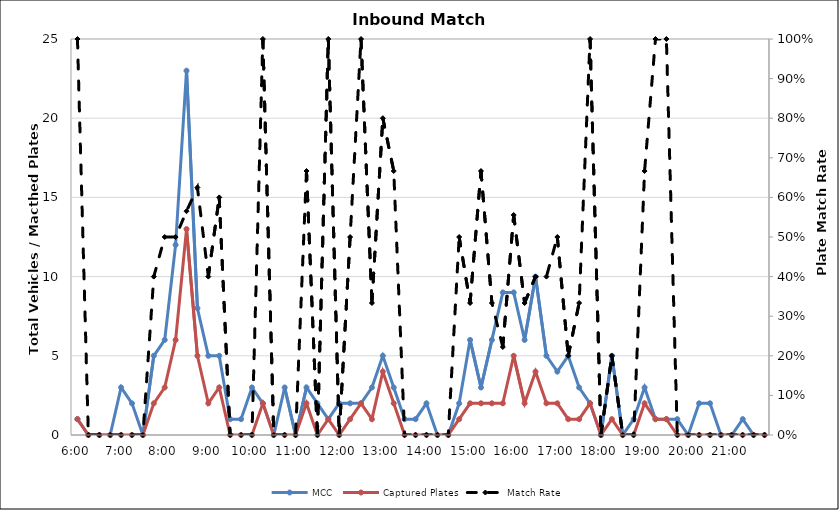
| Category | MCC | Captured Plates |
|---|---|---|
| 0.25 | 1 | 1 |
| 0.260416666666667 | 0 | 0 |
| 0.270833333333333 | 0 | 0 |
| 0.28125 | 0 | 0 |
| 0.291666666666667 | 3 | 0 |
| 0.302083333333333 | 2 | 0 |
| 0.3125 | 0 | 0 |
| 0.322916666666667 | 5 | 2 |
| 0.333333333333333 | 6 | 3 |
| 0.34375 | 12 | 6 |
| 0.354166666666667 | 23 | 13 |
| 0.364583333333333 | 8 | 5 |
| 0.375 | 5 | 2 |
| 0.385416666666667 | 5 | 3 |
| 0.395833333333333 | 1 | 0 |
| 0.40625 | 1 | 0 |
| 0.416666666666667 | 3 | 0 |
| 0.427083333333333 | 2 | 2 |
| 0.4375 | 0 | 0 |
| 0.447916666666667 | 3 | 0 |
| 0.458333333333333 | 0 | 0 |
| 0.46875 | 3 | 2 |
| 0.479166666666667 | 2 | 0 |
| 0.489583333333333 | 1 | 1 |
| 0.5 | 2 | 0 |
| 0.510416666666667 | 2 | 1 |
| 0.520833333333333 | 2 | 2 |
| 0.53125 | 3 | 1 |
| 0.541666666666667 | 5 | 4 |
| 0.552083333333333 | 3 | 2 |
| 0.5625 | 1 | 0 |
| 0.572916666666667 | 1 | 0 |
| 0.583333333333333 | 2 | 0 |
| 0.59375 | 0 | 0 |
| 0.604166666666667 | 0 | 0 |
| 0.614583333333333 | 2 | 1 |
| 0.625 | 6 | 2 |
| 0.635416666666667 | 3 | 2 |
| 0.645833333333333 | 6 | 2 |
| 0.65625 | 9 | 2 |
| 0.666666666666667 | 9 | 5 |
| 0.677083333333333 | 6 | 2 |
| 0.6875 | 10 | 4 |
| 0.697916666666667 | 5 | 2 |
| 0.708333333333333 | 4 | 2 |
| 0.71875 | 5 | 1 |
| 0.729166666666667 | 3 | 1 |
| 0.739583333333333 | 2 | 2 |
| 0.75 | 0 | 0 |
| 0.760416666666667 | 5 | 1 |
| 0.770833333333333 | 0 | 0 |
| 0.78125 | 1 | 0 |
| 0.791666666666667 | 3 | 2 |
| 0.802083333333333 | 1 | 1 |
| 0.8125 | 1 | 1 |
| 0.822916666666667 | 1 | 0 |
| 0.833333333333333 | 0 | 0 |
| 0.84375 | 2 | 0 |
| 0.854166666666667 | 2 | 0 |
| 0.864583333333333 | 0 | 0 |
| 0.875 | 0 | 0 |
| 0.885416666666667 | 1 | 0 |
| 0.895833333333333 | 0 | 0 |
| 0.90625 | 0 | 0 |